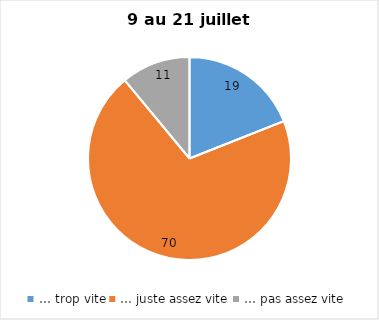
| Category | Series 0 |
|---|---|
| … trop vite | 19 |
| … juste assez vite | 70 |
| … pas assez vite | 11 |